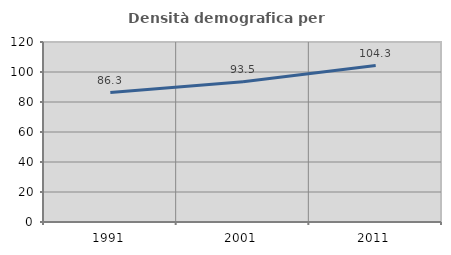
| Category | Densità demografica |
|---|---|
| 1991.0 | 86.269 |
| 2001.0 | 93.54 |
| 2011.0 | 104.324 |